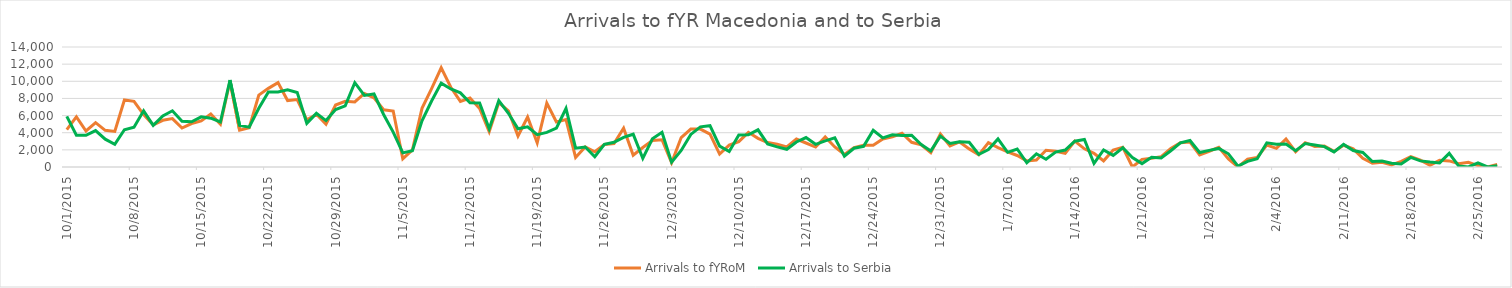
| Category | Arrivals to fYRoM | Arrivals to Serbia |
|---|---|---|
| 10/1/15 | 4370 | 5900 |
| 10/2/15 | 5853 | 3700 |
| 10/3/15 | 4202 | 3700 |
| 10/4/15 | 5181 | 4250 |
| 10/5/15 | 4282 | 3250 |
| 10/6/15 | 4156 | 2650 |
| 10/7/15 | 7816 | 4350 |
| 10/8/15 | 7663 | 4650 |
| 10/9/15 | 6107 | 6550 |
| 10/10/15 | 4922 | 4850 |
| 10/11/15 | 5448 | 5950 |
| 10/12/15 | 5645 | 6556 |
| 10/13/15 | 4551 | 5330 |
| 10/14/15 | 5073 | 5280 |
| 10/15/15 | 5373 | 5850 |
| 10/16/15 | 6181 | 5700 |
| 10/17/15 | 4988 | 5250 |
| 10/18/15 | 10005 | 10150 |
| 10/19/15 | 4299 | 4850 |
| 10/20/15 | 4584 | 4650 |
| 10/21/15 | 8384 | 6850 |
| 10/22/15 | 9174 | 8750 |
| 10/23/15 | 9840 | 8750 |
| 10/24/15 | 7752 | 9000 |
| 10/25/15 | 7864 | 8700 |
| 10/26/15 | 5500 | 5100 |
| 10/27/15 | 6146 | 6257 |
| 10/28/15 | 5000 | 5415 |
| 10/29/15 | 7231 | 6700 |
| 10/30/15 | 7663 | 7138 |
| 10/31/15 | 7590 | 9834 |
| 11/1/15 | 8584 | 8354 |
| 11/2/15 | 8075 | 8521 |
| 11/3/15 | 6682 | 6129 |
| 11/4/15 | 6532 | 4073 |
| 11/5/15 | 960 | 1652 |
| 11/6/15 | 1987 | 1906 |
| 11/7/15 | 6847 | 5397 |
| 11/8/15 | 9148 | 7695 |
| 11/9/15 | 11572 | 9785 |
| 11/10/15 | 9305 | 9107 |
| 11/11/15 | 7651 | 8648 |
| 11/12/15 | 8038 | 7500 |
| 11/13/15 | 6826 | 7464 |
| 11/14/15 | 4107 | 4453 |
| 11/15/15 | 7511 | 7734 |
| 11/16/15 | 6557 | 6267 |
| 11/17/15 | 3621 | 4460 |
| 11/18/15 | 5831 | 4694 |
| 11/19/15 | 2816 | 3765 |
| 11/20/15 | 7453 | 4042 |
| 11/21/15 | 5255 | 4527 |
| 11/22/15 | 5539 | 6826 |
| 11/23/15 | 1113 | 2201 |
| 11/24/15 | 2347 | 2335 |
| 11/25/15 | 1779 | 1194 |
| 11/26/15 | 2617 | 2636 |
| 11/27/15 | 2744 | 2878 |
| 11/28/15 | 4520 | 3454 |
| 11/29/15 | 1373 | 3825 |
| 11/30/15 | 2270 | 1009 |
| 12/1/15 | 3094 | 3284 |
| 12/2/15 | 3174 | 4040 |
| 12/3/15 | 494 | 553 |
| 12/4/15 | 3436 | 1927 |
| 12/5/15 | 4430 | 3799 |
| 12/6/15 | 4425 | 4686 |
| 12/7/15 | 3826 | 4823 |
| 12/8/15 | 1508 | 2437 |
| 12/9/15 | 2550 | 1807 |
| 12/10/15 | 2956 | 3723 |
| 12/11/15 | 4047 | 3747 |
| 12/12/15 | 3338 | 4339 |
| 12/13/15 | 2849 | 2698 |
| 12/14/15 | 2644 | 2353 |
| 12/15/15 | 2349 | 2067 |
| 12/16/15 | 3264 | 2916 |
| 12/17/15 | 2801 | 3438 |
| 12/18/15 | 2332 | 2649 |
| 12/19/15 | 3515 | 3052 |
| 12/20/15 | 2338 | 3405 |
| 12/21/15 | 1470 | 1253 |
| 12/22/15 | 2272 | 2186 |
| 12/23/15 | 2529 | 2415 |
| 12/24/15 | 2529 | 4279 |
| 12/25/15 | 3268 | 3390 |
| 12/26/15 | 3521 | 3757 |
| 12/27/15 | 3938 | 3674 |
| 12/28/15 | 2884 | 3708 |
| 12/29/15 | 2577 | 2629 |
| 12/30/15 | 1665 | 1879 |
| 12/31/15 | 3848 | 3602 |
| 1/1/16 | 2454 | 2745 |
| 1/2/16 | 2918 | 2947 |
| 1/3/16 | 2112 | 2889 |
| 1/4/16 | 1415 | 1462 |
| 1/5/16 | 2842 | 2041 |
| 1/6/16 | 2258 | 3273 |
| 1/7/16 | 1776 | 1715 |
| 1/8/16 | 1344 | 2100 |
| 1/9/16 | 715 | 489 |
| 1/10/16 | 819 | 1538 |
| 1/11/16 | 1959 | 905 |
| 1/12/16 | 1840 | 1743 |
| 1/13/16 | 1600 | 1973 |
| 1/14/16 | 3022 | 3006 |
| 1/15/16 | 2119 | 3213 |
| 1/16/16 | 1598 | 415 |
| 1/17/16 | 720 | 1995 |
| 1/18/16 | 1980 | 1362 |
| 1/19/16 | 2298 | 2244 |
| 1/20/16 | 0 | 1113 |
| 1/21/16 | 892 | 397 |
| 1/22/16 | 1030 | 1134 |
| 1/23/16 | 1208 | 1064 |
| 1/24/16 | 2174 | 1895 |
| 1/25/16 | 2836 | 2827 |
| 1/26/16 | 2908 | 3091 |
| 1/27/16 | 1402 | 1695 |
| 1/28/16 | 1837 | 1940 |
| 1/29/16 | 2292 | 2167 |
| 1/30/16 | 931 | 1540 |
| 1/31/16 | 0 | 103 |
| 2/1/16 | 908 | 660 |
| 2/2/16 | 1121 | 966 |
| 2/3/16 | 2558 | 2825 |
| 2/4/16 | 2173 | 2653 |
| 2/5/16 | 3259 | 2694 |
| 2/6/16 | 1780 | 1901 |
| 2/7/16 | 2838 | 2739 |
| 2/8/16 | 2392 | 2563 |
| 2/9/16 | 2441 | 2379 |
| 2/10/16 | 1817 | 1758 |
| 2/11/16 | 2540 | 2636 |
| 2/12/16 | 2115 | 1923 |
| 2/13/16 | 1019 | 1699 |
| 2/14/16 | 452 | 641 |
| 2/15/16 | 542 | 691 |
| 2/16/16 | 234 | 443 |
| 2/17/16 | 668 | 345 |
| 2/18/16 | 1200 | 1117 |
| 2/19/16 | 799 | 713 |
| 2/20/16 | 209 | 580 |
| 2/21/16 | 774 | 476 |
| 2/22/16 | 714 | 1595 |
| 2/23/16 | 382 | 106 |
| 2/24/16 | 551 | 1 |
| 2/25/16 | 168 | 475 |
| 2/26/16 | 20 | 0 |
| 2/27/16 | 310 | 158 |